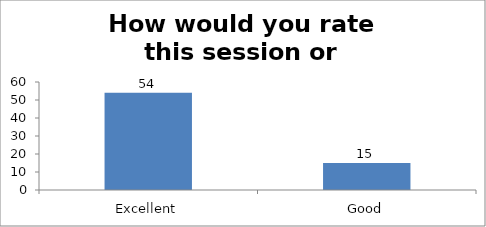
| Category | How would you rate this session or workshop? |
|---|---|
| Excellent | 54 |
| Good | 15 |